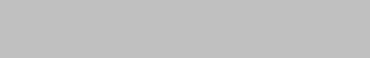
| Category | 1 | 2 | 3 | 4 | 5 | 6 |
|---|---|---|---|---|---|---|
| 0 | 0 | 0 | 0 | 0 | 0 | 0 |
| 1 | 0 | 0 | 0 | 0 | 0 | 0 |
| 2 | 0 | 0 | 0 | 0 | 0 | 0 |
| 3 | 0 | 0 | 0 | 0 | 0 | 0 |
| 4 | 0 | 0 | 0 | 0 | 0 | 0 |
| 5 | 0 | 0 | 0 | 0 | 0 | 0 |
| 6 | 0 | 0 | 0 | 0 | 0 | 0 |